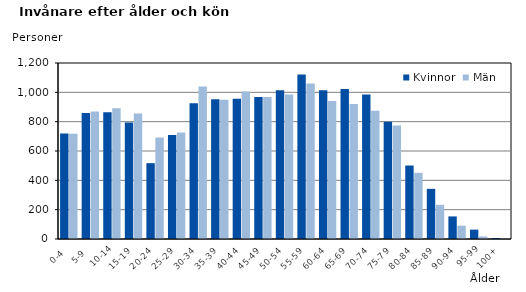
| Category | Kvinnor | Män |
|---|---|---|
|   0-4  | 720 | 717 |
|   5-9  | 859 | 869 |
| 10-14 | 864 | 892 |
| 15-19  | 795 | 855 |
| 20-24  | 517 | 692 |
| 25-29  | 709 | 726 |
| 30-34  | 926 | 1039 |
| 35-39  | 953 | 949 |
| 40-44  | 956 | 1006 |
| 45-49  | 968 | 968 |
| 50-54  | 1015 | 985 |
| 55-59  | 1122 | 1061 |
| 60-64  | 1015 | 941 |
| 65-69  | 1023 | 920 |
| 70-74  | 985 | 875 |
| 75-79  | 800 | 774 |
| 80-84  | 501 | 451 |
| 85-89  | 342 | 233 |
| 90-94  | 154 | 91 |
| 95-99 | 64 | 17 |
| 100+ | 7 | 3 |